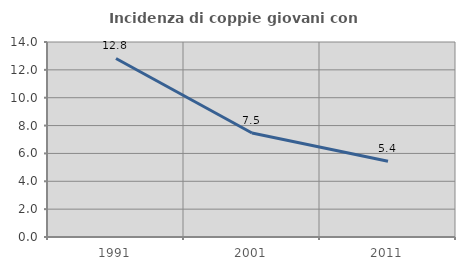
| Category | Incidenza di coppie giovani con figli |
|---|---|
| 1991.0 | 12.817 |
| 2001.0 | 7.465 |
| 2011.0 | 5.435 |